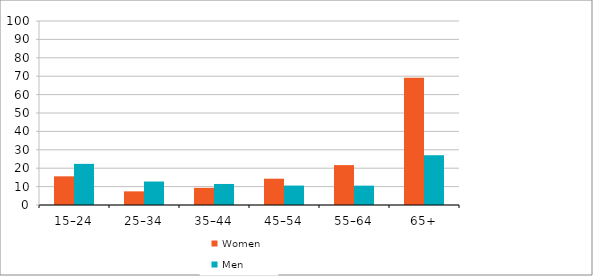
| Category | Women | Men |
|---|---|---|
| 15–24 | 15.584 | 22.361 |
| 25–34 | 7.412 | 12.764 |
| 35–44 | 9.326 | 11.43 |
| 45–54 | 14.292 | 10.563 |
| 55–64 | 21.685 | 10.514 |
| 65+ | 69.09 | 27.049 |